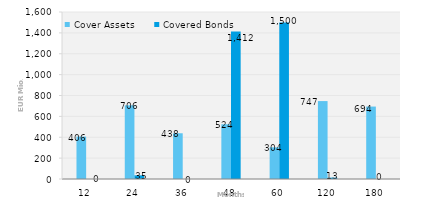
| Category | Cover Assets | Covered Bonds |
|---|---|---|
| 12.0 | 406.35 | 0 |
| 24.0 | 705.734 | 35 |
| 36.0 | 438.183 | 0 |
| 48.0 | 524.434 | 1412.082 |
| 60.0 | 303.634 | 1500 |
| 120.0 | 746.571 | 13 |
| 180.0 | 694.021 | 0 |